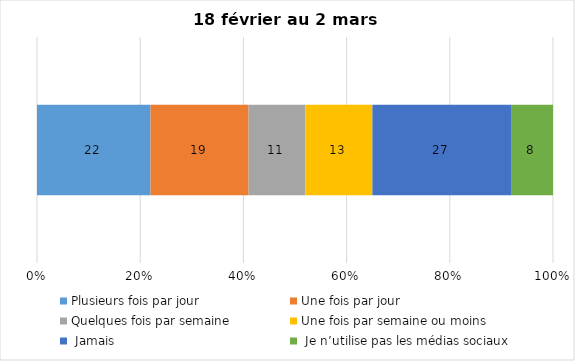
| Category | Plusieurs fois par jour | Une fois par jour | Quelques fois par semaine   | Une fois par semaine ou moins   |  Jamais   |  Je n’utilise pas les médias sociaux |
|---|---|---|---|---|---|---|
| 0 | 22 | 19 | 11 | 13 | 27 | 8 |